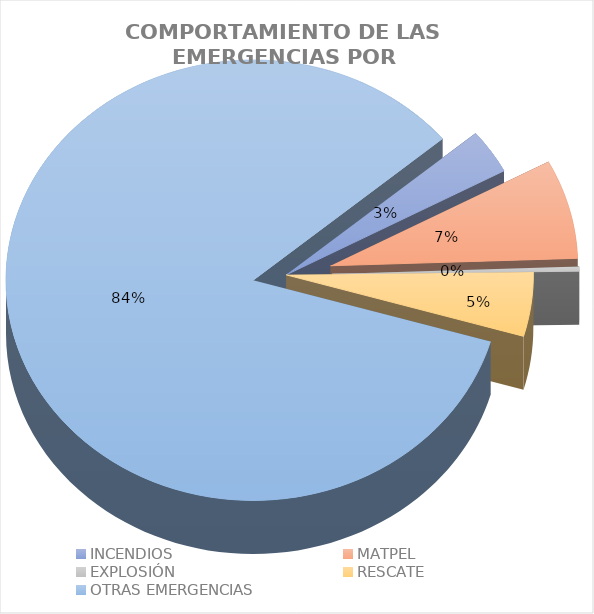
| Category | Incidentes |
|---|---|
| INCENDIOS | 0.033 |
| MATPEL | 0.073 |
| EXPLOSIÓN | 0.003 |
| RESCATE | 0.047 |
| OTRAS EMERGENCIAS | 0.844 |